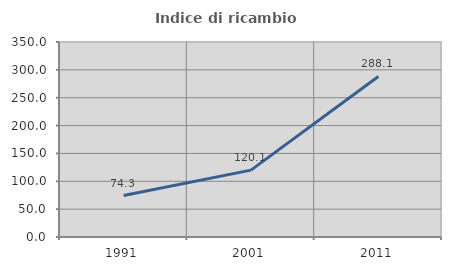
| Category | Indice di ricambio occupazionale  |
|---|---|
| 1991.0 | 74.346 |
| 2001.0 | 120.068 |
| 2011.0 | 288.083 |